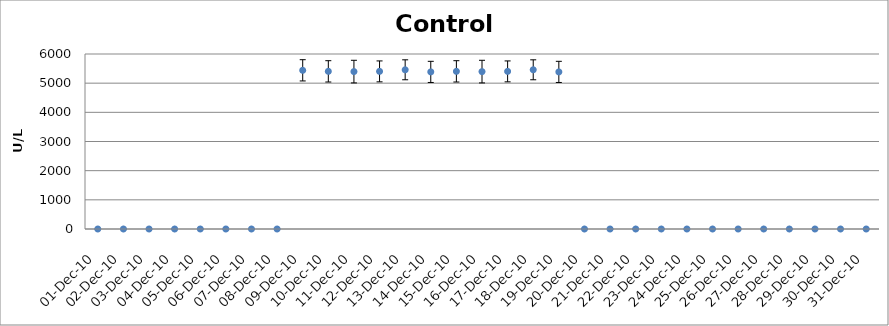
| Category | Mean |
|---|---|
| 1-Dec-10 | 0 |
| 2-Dec-10 | 0 |
| 3-Dec-10 | 0 |
| 4-Dec-10 | 0 |
| 5-Dec-10 | 0 |
| 6-Dec-10 | 0 |
| 7-Dec-10 | 0 |
| 8-Dec-10 | 0 |
| 9-Dec-10 | 5440.336 |
| 10-Dec-10 | 5404.955 |
| 11-Dec-10 | 5396.204 |
| 12-Dec-10 | 5404.09 |
| 13-Dec-10 | 5458.401 |
| 14-Dec-10 | 5386.259 |
| 15-Dec-10 | 5404.955 |
| 16-Dec-10 | 5396.204 |
| 17-Dec-10 | 5404.09 |
| 18-Dec-10 | 5458.401 |
| 19-Dec-10 | 5386.259 |
| 20-Dec-10 | 0 |
| 21-Dec-10 | 0 |
| 22-Dec-10 | 0 |
| 23-Dec-10 | 0 |
| 24-Dec-10 | 0 |
| 25-Dec-10 | 0 |
| 26-Dec-10 | 0 |
| 27-Dec-10 | 0 |
| 28-Dec-10 | 0 |
| 29-Dec-10 | 0 |
| 30-Dec-10 | 0 |
| 31-Dec-10 | 0 |